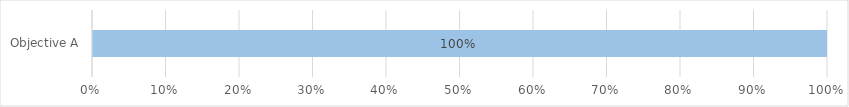
| Category | Not yet assessed | Not achieved | Partially Achieved | Achieved |
|---|---|---|---|---|
| Objective A | 1 | 0 | 0 | 0 |